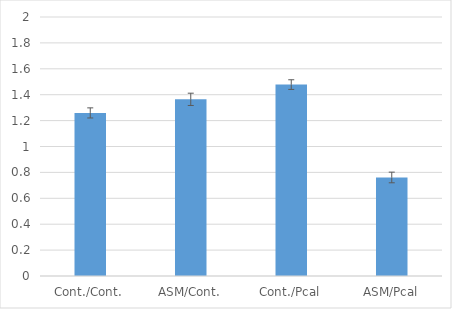
| Category | Series 0 |
|---|---|
| Cont./Cont. | 1.259 |
| ASM/Cont. | 1.364 |
| Cont./Pcal | 1.478 |
| ASM/Pcal | 0.761 |